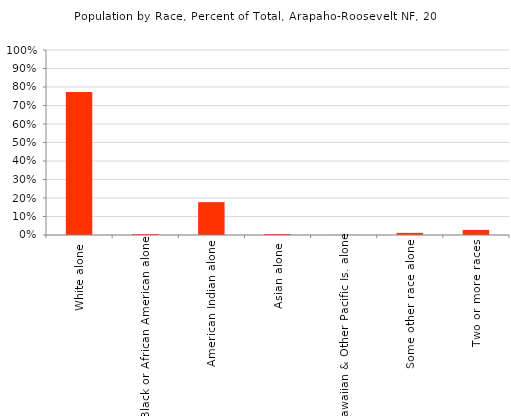
| Category | Series 0 |
|---|---|
| White alone | 0.951 |
| Black or African American alone | 0.004 |
| American Indian alone | 0.01 |
| Asian alone | 0.01 |
| Native Hawaiian & Other Pacific Is. alone | 0.001 |
| Some other race alone | 0.005 |
| Two or more races | 0.019 |